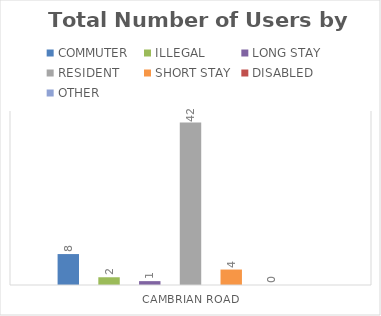
| Category | COMMUTER | ILLEGAL | LONG STAY | RESIDENT | SHORT STAY | DISABLED | OTHER |
|---|---|---|---|---|---|---|---|
| CAMBRIAN ROAD | 8 | 2 | 1 | 42 | 4 | 0 | 0 |